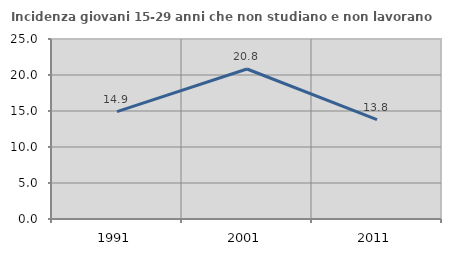
| Category | Incidenza giovani 15-29 anni che non studiano e non lavorano  |
|---|---|
| 1991.0 | 14.918 |
| 2001.0 | 20.833 |
| 2011.0 | 13.793 |